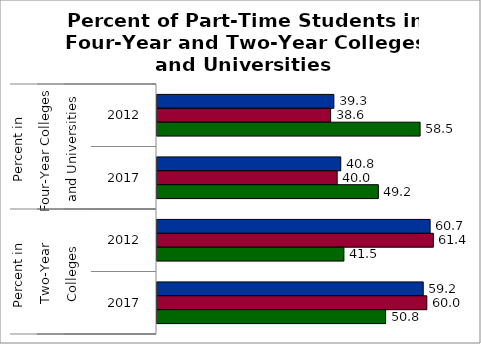
| Category | 50 states and D.C. | SREB states | State |
|---|---|---|---|
| 0 | 39.303 | 38.582 | 58.465 |
| 1 | 40.836 | 40.039 | 49.198 |
| 2 | 60.697 | 61.418 | 41.535 |
| 3 | 59.164 | 59.961 | 50.802 |